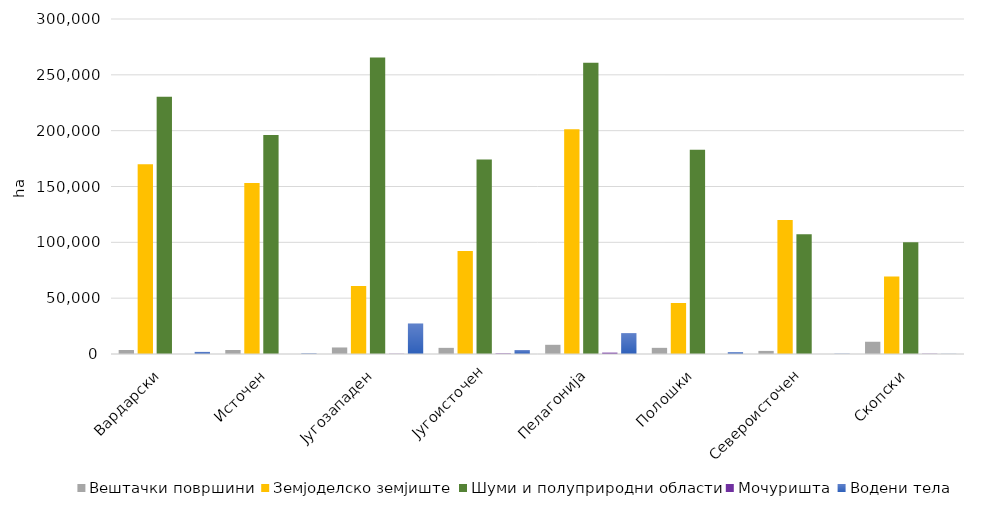
| Category | Вештачки површини | Земјоделско земјиште | Шуми и полуприродни области | Мочуришта | Водени тела |
|---|---|---|---|---|---|
| Вардарски | 3559.37 | 169872.11 | 230400.92 | 0 | 1878.68 |
| Источен | 3593.55 | 153069.21 | 196033.21 | 0 | 450.296 |
| Југозападен | 5848.69 | 60855.06 | 265571.5 | 193.609 | 27344.29 |
| Југоисточен | 5503.41 | 92341.29 | 174138.97 | 497.933 | 3513.46 |
| Пелагонија | 8241.93 | 201287.24 | 260710.24 | 1218.98 | 18701.95 |
| Полошки | 5511.14 | 45647.42 | 182805.31 | 0 | 1657.86 |
| Североисточен | 2766.27 | 120011.07 | 107304.06 | 0 | 221.77 |
| Скопски | 10968.87 | 69424.97 | 100031.04 | 243.308 | 137.105 |